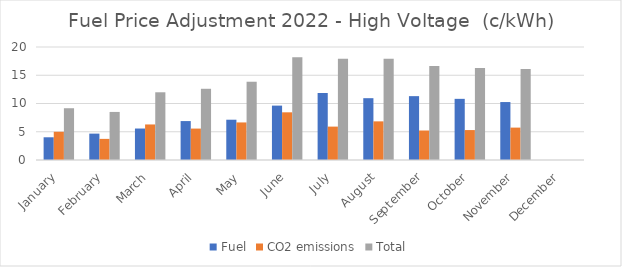
| Category | Fuel | CO2 emissions | Total |
|---|---|---|---|
| January | 4.02 | 4.996 | 9.163 |
| February | 4.67 | 3.738 | 8.506 |
| March | 5.571 | 6.291 | 11.986 |
| April | 6.89 | 5.562 | 12.606 |
| May | 7.13 | 6.649 | 13.852 |
| June | 9.626 | 8.44 | 18.192 |
| July | 11.861 | 5.91 | 17.936 |
| August | 10.941 | 6.838 | 17.904 |
| September | 11.303 | 5.221 | 16.658 |
| October | 10.824 | 5.298 | 16.264 |
| November | 10.257 | 5.733 | 16.114 |
| December | 0 | 0 | 0 |